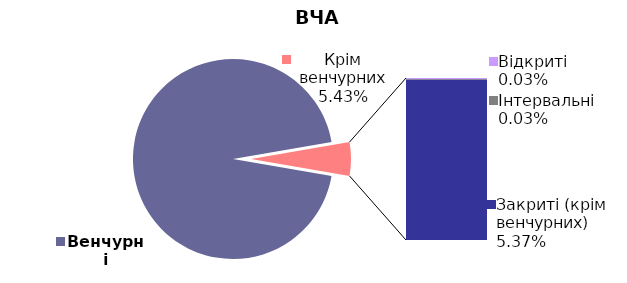
| Category | 31.03.2020 |
|---|---|
| Венчурні | 0.946 |
| Відкриті | 0 |
| Інтервальні | 0 |
| Закриті (крім венчурних) | 0.054 |